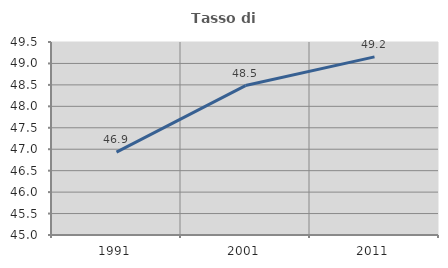
| Category | Tasso di occupazione   |
|---|---|
| 1991.0 | 46.931 |
| 2001.0 | 48.484 |
| 2011.0 | 49.153 |